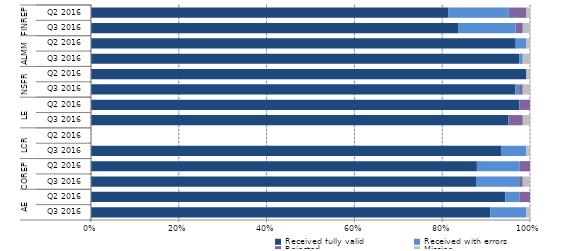
| Category | Received fully valid | Received with errors | Rejected | Missing |
|---|---|---|---|---|
| 0 | 111 | 10 | 0 | 1 |
| 1 | 117 | 4 | 3 | 0 |
| 2 | 107 | 12 | 1 | 2 |
| 3 | 109 | 12 | 3 | 0 |
| 4 | 113 | 7 | 0 | 1 |
| 5 | 0 | 0 | 0 | 0 |
| 6 | 116 | 0 | 4 | 2 |
| 7 | 121 | 0 | 3 | 0 |
| 8 | 117 | 1 | 1 | 2 |
| 9 | 121 | 0 | 0 | 1 |
| 10 | 118 | 1 | 0 | 2 |
| 11 | 119 | 3 | 0 | 1 |
| 12 | 102 | 16 | 2 | 2 |
| 13 | 101 | 17 | 5 | 1 |